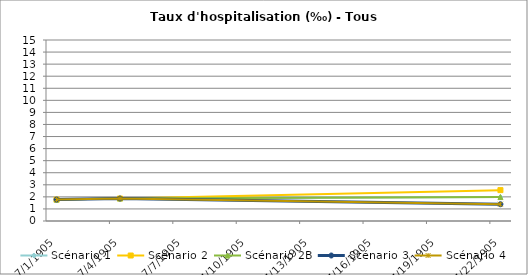
| Category | Scénario 1 | Scénario 2 | Scénario 2B | Scénario 3 | Scénario 4 |
|---|---|---|---|---|---|
| 2009.0 | 1.776 | 1.776 | 1.776 | 1.776 | 1.776 |
| 2012.0 | 1.864 | 1.864 | 1.864 | 1.864 | 1.864 |
| 2030.0 | 1.983 | 2.558 | 1.983 | 1.388 | 1.388 |